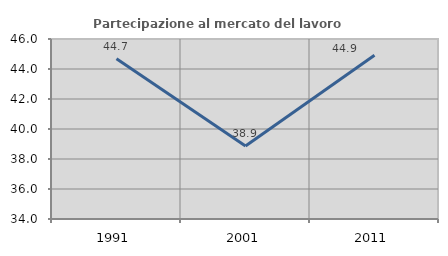
| Category | Partecipazione al mercato del lavoro  femminile |
|---|---|
| 1991.0 | 44.691 |
| 2001.0 | 38.861 |
| 2011.0 | 44.91 |